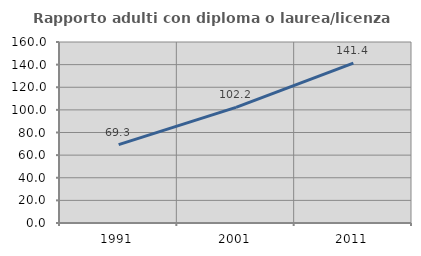
| Category | Rapporto adulti con diploma o laurea/licenza media  |
|---|---|
| 1991.0 | 69.268 |
| 2001.0 | 102.222 |
| 2011.0 | 141.406 |